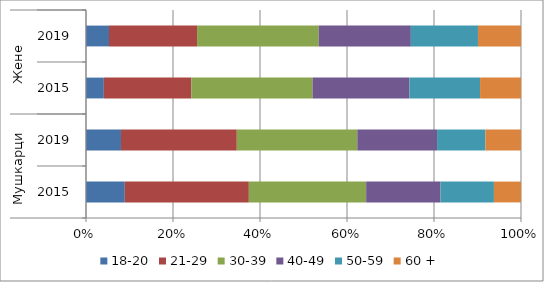
| Category | 18-20 | 21-29 | 30-39 | 40-49 | 50-59 | 60 + |
|---|---|---|---|---|---|---|
| 0 | 2676 | 8554 | 8090 | 5124 | 3687 | 1867 |
| 1 | 2018 | 6681 | 6951 | 4601 | 2791 | 2051 |
| 2 | 126 | 617 | 856 | 684 | 499 | 289 |
| 3 | 148 | 567 | 783 | 593 | 432 | 277 |